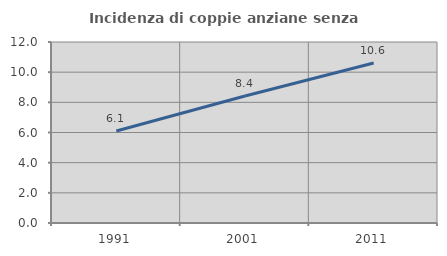
| Category | Incidenza di coppie anziane senza figli  |
|---|---|
| 1991.0 | 6.096 |
| 2001.0 | 8.424 |
| 2011.0 | 10.604 |